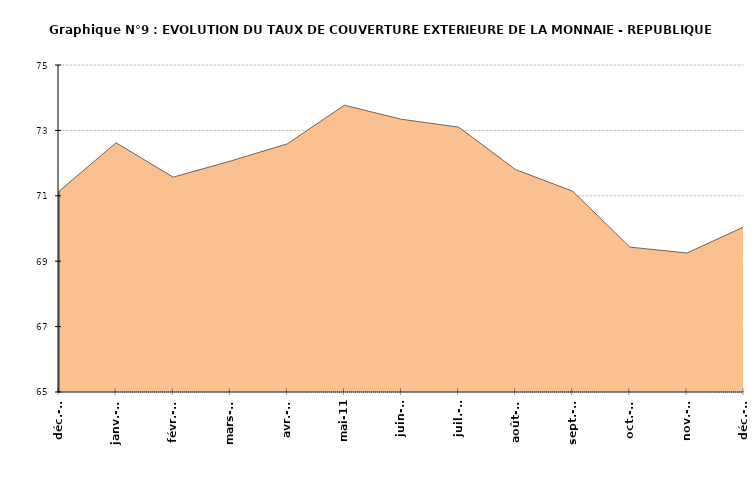
| Category | RCA |
|---|---|
| 2010-12-07 | 71.14 |
| 2011-01-08 | 72.62 |
| 2011-02-09 | 71.57 |
| 2011-03-10 | 72.06 |
| 2011-04-08 | 72.59 |
| 2011-05-07 | 73.77 |
| 2011-06-05 | 73.34 |
| 2011-07-04 | 73.1 |
| 2011-08-02 | 71.8 |
| 2011-09-30 | 71.14 |
| 2011-10-30 | 69.43 |
| 2011-11-30 | 69.25 |
| 2011-12-30 | 70.05 |